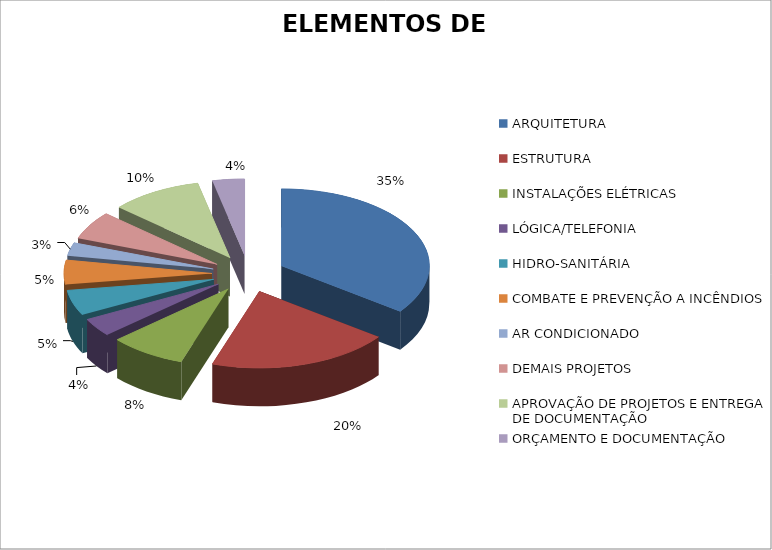
| Category | Series 0 |
|---|---|
| ARQUITETURA | 0.352 |
| ESTRUTURA | 0.2 |
| INSTALAÇÕES ELÉTRICAS | 0.084 |
| LÓGICA/TELEFONIA | 0.038 |
| HIDRO-SANITÁRIA | 0.054 |
| COMBATE E PREVENÇÃO A INCÊNDIOS | 0.051 |
| AR CONDICIONADO | 0.028 |
| DEMAIS PROJETOS | 0.06 |
| APROVAÇÃO DE PROJETOS E ENTREGA DE DOCUMENTAÇÃO | 0.1 |
| ORÇAMENTO E DOCUMENTAÇÃO | 0.035 |